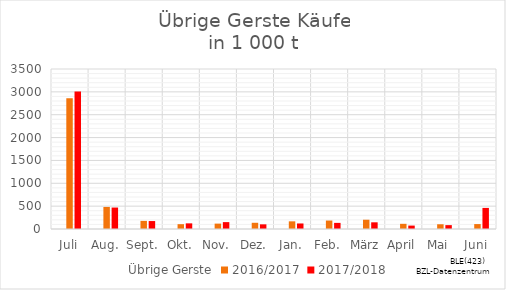
| Category | Übrige Gerste | 2016/2017 | 2017/2018 |
|---|---|---|---|
| Juli |  | 2861.141 | 3010.503 |
| Aug. |  | 482.247 | 469.329 |
| Sept. |  | 177.437 | 173.879 |
| Okt. |  | 105.532 | 123.502 |
| Nov. |  | 117.639 | 150.489 |
| Dez. |  | 136.025 | 101.961 |
| Jan. |  | 167.601 | 121.05 |
| Feb. |  | 184.959 | 133.964 |
| März |  | 202.907 | 146.275 |
| April |  | 113.243 | 74.932 |
| Mai |  | 103.69 | 84.684 |
| Juni |  | 107.726 | 461.186 |